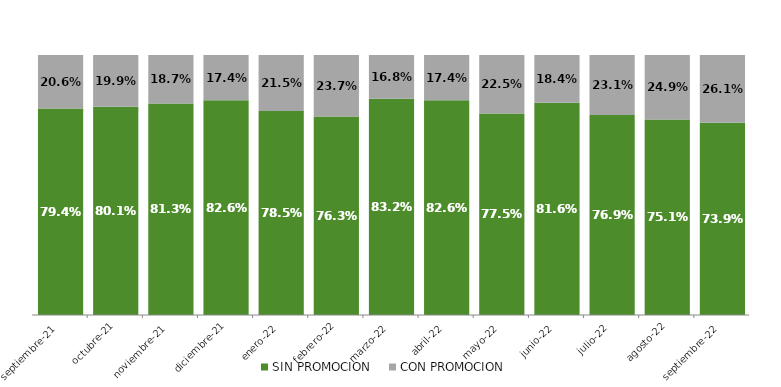
| Category | SIN PROMOCION   | CON PROMOCION   |
|---|---|---|
| 2021-09-01 | 0.794 | 0.206 |
| 2021-10-01 | 0.801 | 0.199 |
| 2021-11-01 | 0.813 | 0.187 |
| 2021-12-01 | 0.826 | 0.174 |
| 2022-01-01 | 0.785 | 0.215 |
| 2022-02-01 | 0.763 | 0.237 |
| 2022-03-01 | 0.832 | 0.168 |
| 2022-04-01 | 0.826 | 0.174 |
| 2022-05-01 | 0.775 | 0.225 |
| 2022-06-01 | 0.816 | 0.184 |
| 2022-07-01 | 0.769 | 0.231 |
| 2022-08-01 | 0.751 | 0.249 |
| 2022-09-01 | 0.739 | 0.261 |